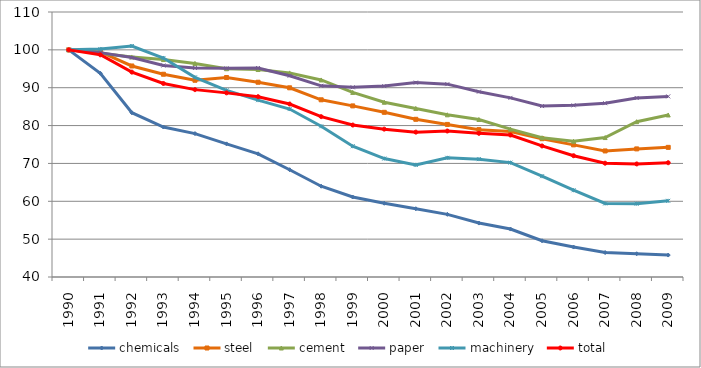
| Category | chemicals | steel | cement | paper | machinery | total |
|---|---|---|---|---|---|---|
| 1990.0 | 100 | 100 | 100 | 100 | 100 | 100 |
| 1991.0 | 93.828 | 99.457 | 99.097 | 99.265 | 100.232 | 98.695 |
| 1992.0 | 83.393 | 95.742 | 98.118 | 97.98 | 101.015 | 94.117 |
| 1993.0 | 79.621 | 93.56 | 97.444 | 95.876 | 97.854 | 91.119 |
| 1994.0 | 77.885 | 91.969 | 96.42 | 95.222 | 92.737 | 89.494 |
| 1995.0 | 75.167 | 92.69 | 95.013 | 95.132 | 89.315 | 88.637 |
| 1996.0 | 72.536 | 91.447 | 94.807 | 95.201 | 86.714 | 87.635 |
| 1997.0 | 68.339 | 89.976 | 93.91 | 93.158 | 84.363 | 85.696 |
| 1998.0 | 63.981 | 86.808 | 92.05 | 90.5 | 79.81 | 82.363 |
| 1999.0 | 61.129 | 85.196 | 88.762 | 90.107 | 74.542 | 80.141 |
| 2000.0 | 59.483 | 83.5 | 86.16 | 90.428 | 71.289 | 79.057 |
| 2001.0 | 58.036 | 81.657 | 84.527 | 91.349 | 69.623 | 78.268 |
| 2002.0 | 56.547 | 80.306 | 82.839 | 90.945 | 71.483 | 78.563 |
| 2003.0 | 54.248 | 78.926 | 81.609 | 88.955 | 71.131 | 77.947 |
| 2004.0 | 52.665 | 78.429 | 79.068 | 87.32 | 70.216 | 77.495 |
| 2005.0 | 49.571 | 76.533 | 76.784 | 85.15 | 66.629 | 74.623 |
| 2006.0 | 47.913 | 74.903 | 75.853 | 85.343 | 62.923 | 72.033 |
| 2007.0 | 46.454 | 73.299 | 76.835 | 85.909 | 59.426 | 70.059 |
| 2008.0 | 46.14 | 73.839 | 81.024 | 87.291 | 59.378 | 69.865 |
| 2009.0 | 45.797 | 74.245 | 82.799 | 87.706 | 60.121 | 70.186 |